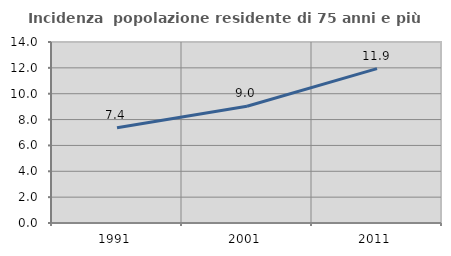
| Category | Incidenza  popolazione residente di 75 anni e più |
|---|---|
| 1991.0 | 7.373 |
| 2001.0 | 9.033 |
| 2011.0 | 11.941 |